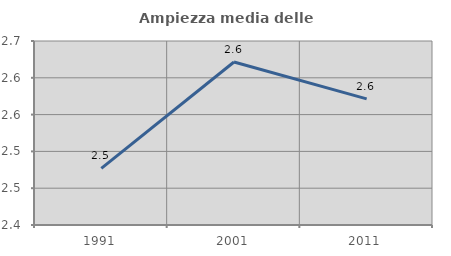
| Category | Ampiezza media delle famiglie |
|---|---|
| 1991.0 | 2.477 |
| 2001.0 | 2.621 |
| 2011.0 | 2.571 |